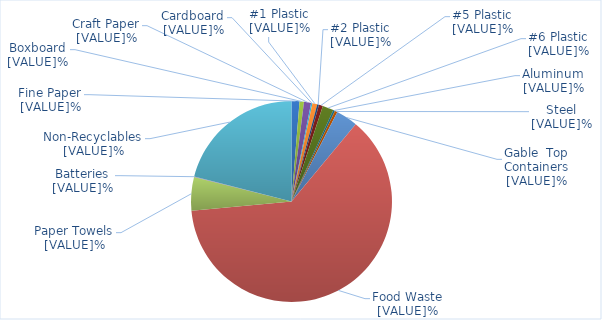
| Category | Series 0 |
|---|---|
| 0 | 1.281 |
| 1 | 0 |
| 2 | 0.712 |
| 3 | 1.139 |
| 4 | 0.214 |
| 5 | 0.783 |
| 6 | 0.285 |
| 7 | 0.641 |
| 8 | 1.779 |
| 9 | 0 |
| 10 | 0.285 |
| 11 | 0.427 |
| 12 | 3.488 |
| 13 | 62.491 |
| 14 | 5.409 |
| 15 | 0.071 |
| 16 | 20.996 |